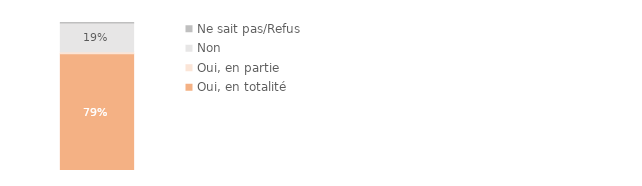
| Category | Oui, en totalité | Oui, en partie | Non | Ne sait pas/Refus |
|---|---|---|---|---|
| 0 | 0.789 | 0.013 | 0.194 | 0.004 |